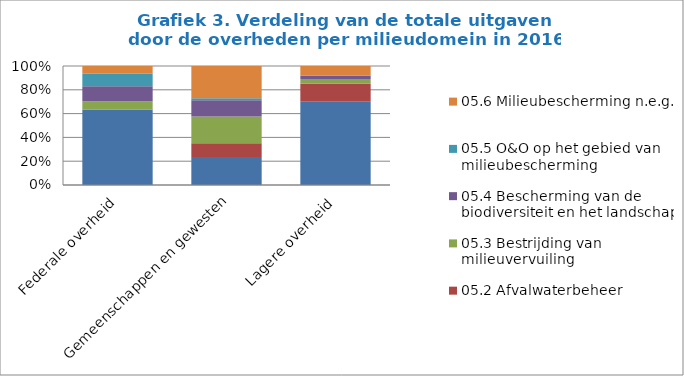
| Category | 05.1 Afvalbeheer | 05.2 Afvalwaterbeheer | 05.3 Bestrijding van milieuvervuiling | 05.4 Bescherming van de biodiversiteit en het landschap | 05.5 O&O op het gebied van milieubescherming | 05.6 Milieubescherming n.e.g. |
|---|---|---|---|---|---|---|
| Federale overheid | 238.5 | 0 | 26 | 47.6 | 39.5 | 24.3 |
| Gemeenschappen en gewesten | 279.6 | 138.8 | 268.4 | 162.1 | 19 | 323.3 |
| Lagere overheid | 1502 | 314.8 | 86.5 | 58.9 | 0 | 173.5 |